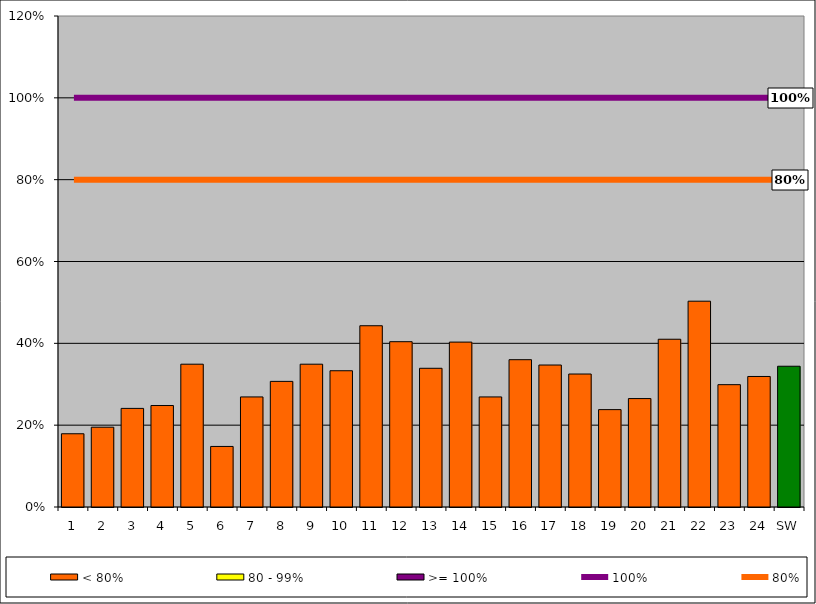
| Category | < 80% | 80 - 99% | >= 100% |
|---|---|---|---|
| 1 | 0.179 | 0 | 0 |
| 2 | 0.195 | 0 | 0 |
| 3 | 0.241 | 0 | 0 |
| 4 | 0.248 | 0 | 0 |
| 5 | 0.349 | 0 | 0 |
| 6 | 0.148 | 0 | 0 |
| 7 | 0.269 | 0 | 0 |
| 8 | 0.307 | 0 | 0 |
| 9 | 0.349 | 0 | 0 |
| 10 | 0.333 | 0 | 0 |
| 11 | 0.443 | 0 | 0 |
| 12 | 0.404 | 0 | 0 |
| 13 | 0.339 | 0 | 0 |
| 14 | 0.403 | 0 | 0 |
| 15 | 0.269 | 0 | 0 |
| 16 | 0.36 | 0 | 0 |
| 17 | 0.347 | 0 | 0 |
| 18 | 0.325 | 0 | 0 |
| 19 | 0.238 | 0 | 0 |
| 20 | 0.265 | 0 | 0 |
| 21 | 0.41 | 0 | 0 |
| 22 | 0.503 | 0 | 0 |
| 23 | 0.299 | 0 | 0 |
| 24 | 0.319 | 0 | 0 |
| SW | 0.344 | 0 | 0 |